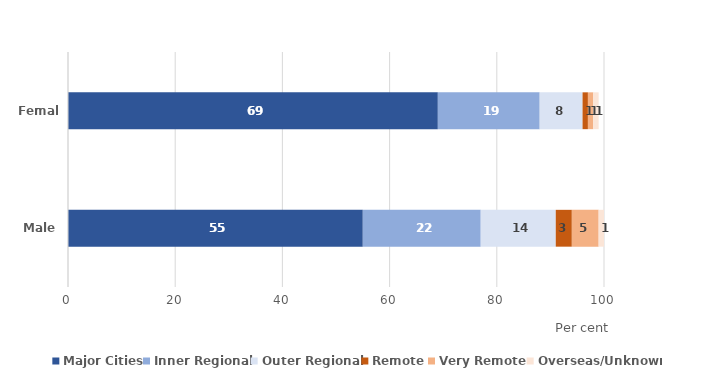
| Category | Major Cities | Inner Regional | Outer Regional | Remote | Very Remote | Overseas/Unknown |
|---|---|---|---|---|---|---|
| Male | 55 | 22 | 14 | 3 | 5 | 1 |
| Female | 69 | 19 | 8 | 1 | 1 | 1 |